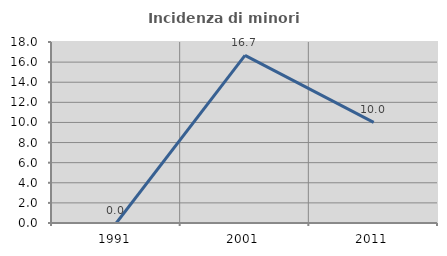
| Category | Incidenza di minori stranieri |
|---|---|
| 1991.0 | 0 |
| 2001.0 | 16.667 |
| 2011.0 | 10 |